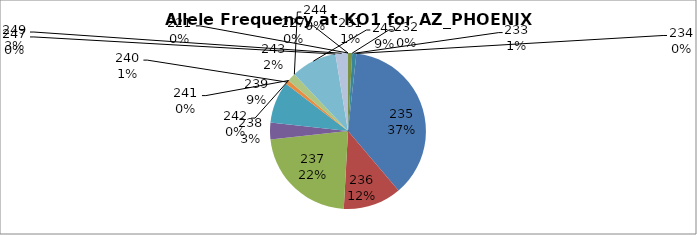
| Category | Series 0 |
|---|---|
| 221.0 | 0 |
| 227.0 | 0 |
| 231.0 | 0.009 |
| 232.0 | 0 |
| 233.0 | 0.009 |
| 234.0 | 0 |
| 235.0 | 0.371 |
| 236.0 | 0.121 |
| 237.0 | 0.224 |
| 238.0 | 0.034 |
| 239.0 | 0.086 |
| 240.0 | 0.009 |
| 241.0 | 0 |
| 242.0 | 0 |
| 243.0 | 0.017 |
| 244.0 | 0 |
| 245.0 | 0.095 |
| 247.0 | 0 |
| 249.0 | 0.026 |